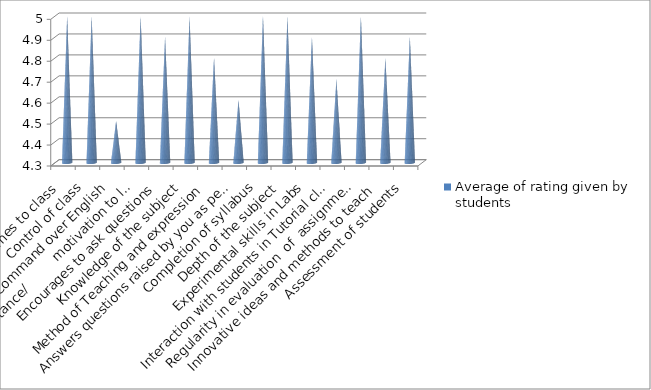
| Category | Average of rating given by students |
|---|---|
| teacher comes to class | 5 |
| Control of class | 5 |
| Command over English | 4.5 |
| Offers assistance/          motivation to learn | 5 |
| Encourages to ask questions | 4.9 |
| Knowledge of the subject | 5 |
| Method of Teaching and expression | 4.8 |
| Answers questions raised by you as per expectations | 4.6 |
| Completion of syllabus | 5 |
| Depth of the subject | 5 |
| Experimental skills in Labs  | 4.9 |
| Interaction with students in Tutorial class | 4.7 |
| Regularity in evaluation  of  assignments, class tests etc. | 5 |
| Innovative ideas and methods to teach | 4.8 |
| Assessment of students | 4.9 |